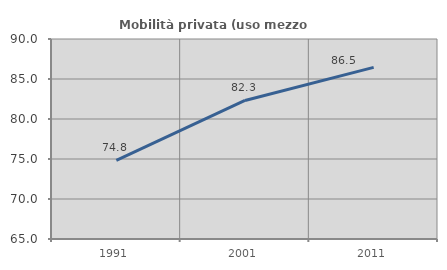
| Category | Mobilità privata (uso mezzo privato) |
|---|---|
| 1991.0 | 74.839 |
| 2001.0 | 82.317 |
| 2011.0 | 86.452 |